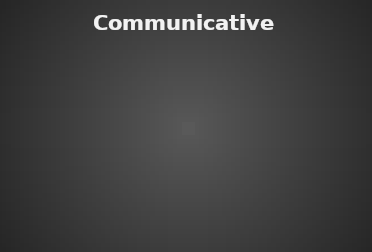
| Category | Communicative English |
|---|---|
| % of Students passed | 0 |
| % of Students need improvement | 0 |